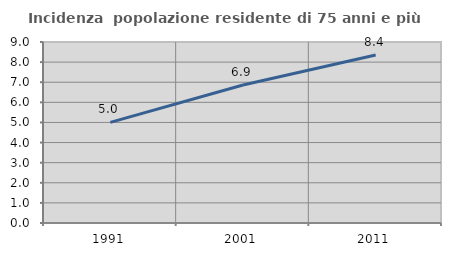
| Category | Incidenza  popolazione residente di 75 anni e più |
|---|---|
| 1991.0 | 5.001 |
| 2001.0 | 6.859 |
| 2011.0 | 8.356 |